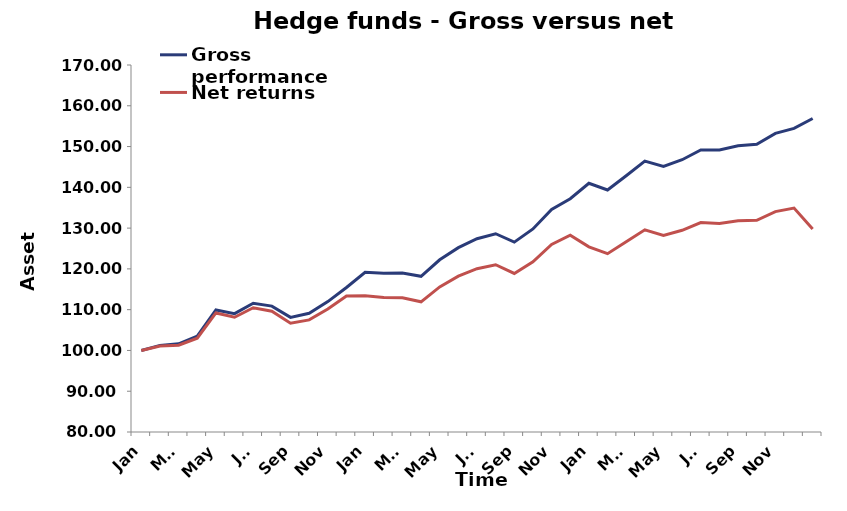
| Category | Gross performance | Net returns |
|---|---|---|
| Jan | 100 | 100 |
| Feb | 101.236 | 101.07 |
| Mar | 101.632 | 101.296 |
| Apr | 103.532 | 103.02 |
| May | 109.916 | 109.201 |
| Jun | 109.026 | 108.135 |
| Jul | 111.571 | 110.478 |
| Aug | 110.873 | 109.602 |
| Sep | 108.11 | 106.688 |
| Oct | 109.106 | 107.493 |
| Nov | 111.98 | 110.145 |
| Dec | 115.449 | 113.373 |
| Jan | 119.156 | 113.421 |
| Feb | 118.905 | 112.988 |
| Mar | 119.005 | 112.894 |
| Apr | 118.179 | 111.923 |
| May | 122.237 | 115.578 |
| Jun | 125.215 | 118.201 |
| Jul | 127.389 | 120.057 |
| Aug | 128.626 | 121.022 |
| Sep | 126.567 | 118.882 |
| Oct | 129.803 | 121.724 |
| Nov | 134.591 | 126.01 |
| Dec | 137.208 | 128.25 |
| Jan | 140.985 | 125.41 |
| Feb | 139.342 | 123.73 |
| Mar | 142.849 | 126.637 |
| Apr | 146.414 | 129.585 |
| May | 145.113 | 128.217 |
| Jun | 146.771 | 129.469 |
| Jul | 149.146 | 131.348 |
| Aug | 149.163 | 131.143 |
| Sep | 150.178 | 131.817 |
| Oct | 150.538 | 131.913 |
| Nov | 153.229 | 134.051 |
| Dec | 154.467 | 134.909 |